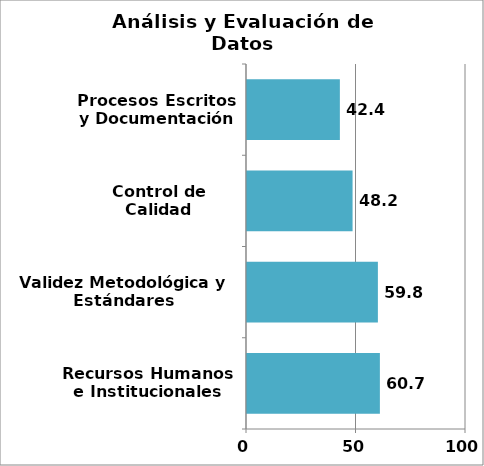
| Category | Series 0 |
|---|---|
| Recursos Humanos e Institucionales | 60.678 |
| Validez Metodológica y Estándares Internacionales | 59.764 |
| Control de Calidad | 48.205 |
| Procesos Escritos y Documentación | 42.407 |